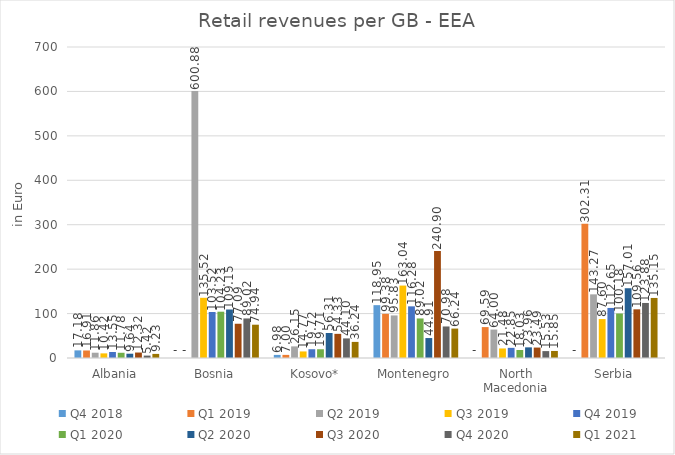
| Category | Q4 2018 | Q1 2019 | Q2 2019 | Q3 2019 | Q4 2019 | Q1 2020 | Q2 2020 | Q3 2020 | Q4 2020 | Q1 2021 |
|---|---|---|---|---|---|---|---|---|---|---|
| Albania | 17.178 | 16.905 | 11.865 | 10.424 | 13.553 | 11.783 | 9.642 | 12.315 | 5.418 | 9.227 |
| Bosnia | 0 | 0 | 600.885 | 135.515 | 103.52 | 104.232 | 109.151 | 77.09 | 89.019 | 74.943 |
| Kosovo* | 6.982 | 7.001 | 26.146 | 14.771 | 19.72 | 19.707 | 56.312 | 54.333 | 44.105 | 36.24 |
| Montenegro | 118.947 | 99.382 | 95.828 | 163.045 | 116.276 | 89.017 | 44.906 | 240.9 | 70.975 | 66.237 |
| North Macedonia | 0 | 69.586 | 63.996 | 21.484 | 22.845 | 18.034 | 23.963 | 23.491 | 15.532 | 15.849 |
| Serbia | 0 | 302.31 | 143.272 | 87.603 | 112.654 | 100.177 | 157.007 | 109.558 | 123.879 | 135.147 |